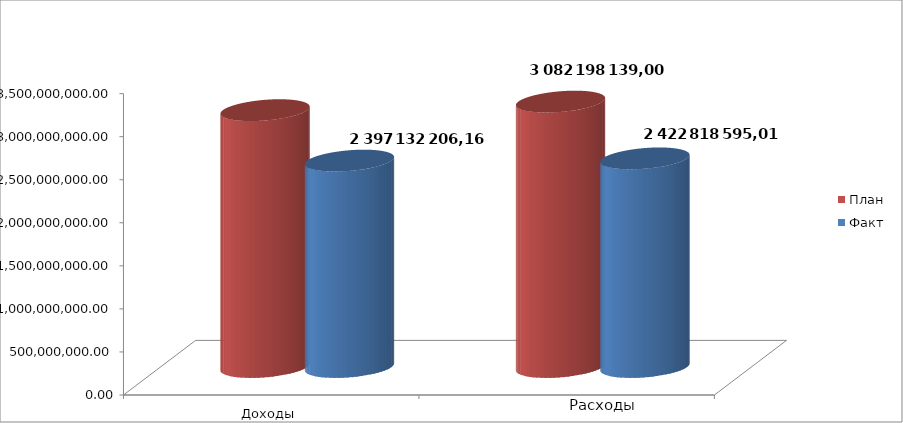
| Category | План | Факт |
|---|---|---|
| 0 | 2982775722.65 | 2397132206.16 |
| 1 | 3082198139 | 2422818595.01 |